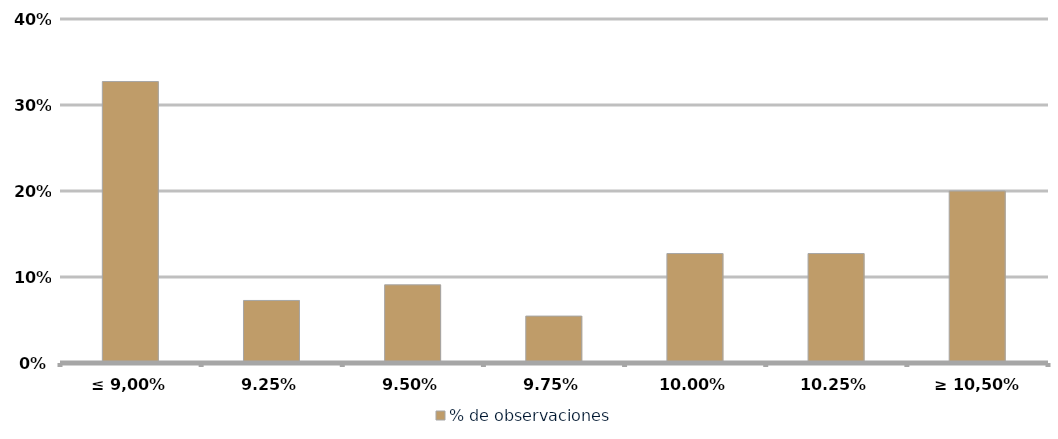
| Category | % de observaciones  |
|---|---|
| ≤ 9,00% | 0.327 |
| 9,25% | 0.073 |
| 9,50% | 0.091 |
| 9,75% | 0.055 |
| 10,00% | 0.127 |
| 10,25% | 0.127 |
| ≥ 10,50% | 0.2 |